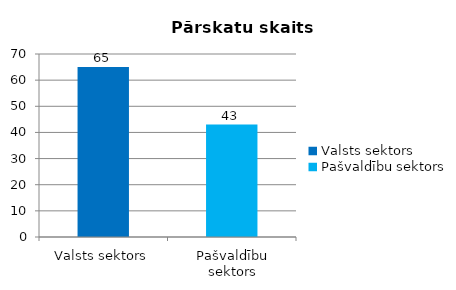
| Category |  Pārskatu skaits |
|---|---|
| Valsts sektors | 65 |
| Pašvaldību sektors | 43 |